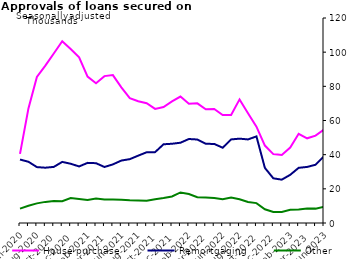
| Category | House purchase | Remortgaging | Other |
|---|---|---|---|
| Jun-2020 | 40466 | 37152 | 8437 |
| Jul-2020 | 67080 | 35848 | 10121 |
| Aug-2020 | 85474 | 32723 | 11495 |
| Sep-2020 | 92083 | 32370 | 12360 |
| Oct-2020 | 99216 | 32836 | 12873 |
| Nov-2020 | 106364 | 35764 | 12729 |
| Dec-2020 | 101818 | 34686 | 14569 |
| Jan-2021 | 96975 | 33105 | 14073 |
| Feb-2021 | 85700 | 35198 | 13535 |
| Mar-2021 | 81853 | 35012 | 14344 |
| Apr-2021 | 85979 | 32788 | 13812 |
| May-2021 | 86582 | 34311 | 13761 |
| Jun-2021 | 79396 | 36554 | 13645 |
| Jul-2021 | 73093 | 37372 | 13301 |
| Aug-2021 | 71270 | 39425 | 13212 |
| Sep-2021 | 70125 | 41396 | 12996 |
| Oct-2021 | 66773 | 41485 | 13916 |
| Nov-2021 | 67909 | 46077 | 14605 |
| Dec-2021 | 71183 | 46390 | 15541 |
| Jan-2022 | 74025 | 46989 | 17896 |
| Feb-2022 | 69753 | 49171 | 16992 |
| Mar-2022 | 70041 | 48872 | 15107 |
| Apr-2022 | 66571 | 46348 | 14974 |
| May-2022 | 66697 | 46290 | 14574 |
| Jun-2022 | 63157 | 44062 | 13929 |
| Jul-2022 | 63169 | 48925 | 14878 |
| Aug-2022 | 72355 | 49374 | 13904 |
| Sep-2022 | 64231 | 48919 | 12281 |
| Oct-2022 | 56419 | 50687 | 11642 |
| Nov-2022 | 45331 | 32246 | 8035 |
| Dec-2022 | 40330 | 26156 | 6504 |
| Jan-2023 | 39825 | 25371 | 6483 |
| Feb-2023 | 44162 | 28205 | 7771 |
| Mar-2023 | 52218 | 32301 | 7887 |
| Apr-2023 | 49568 | 32816 | 8465 |
| May-2023 | 51143 | 34097 | 8415 |
| Jun-2023 | 54662 | 39102 | 9498 |